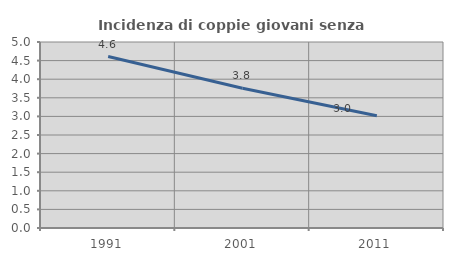
| Category | Incidenza di coppie giovani senza figli |
|---|---|
| 1991.0 | 4.608 |
| 2001.0 | 3.756 |
| 2011.0 | 3.017 |